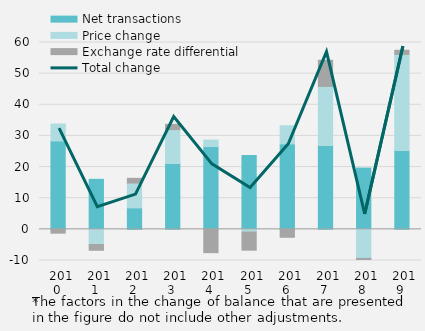
| Category | Net transactions | Price change | Exchange rate differential |
|---|---|---|---|
| 2010 | 28378.01 | 5442.489 | -1228.659 |
| 2011 | 16064.297 | -4861.316 | -1853.468 |
| 2012 | 6884.762 | 7983.318 | 1518.892 |
| 2013 | 21137.009 | 10900.181 | 1685.825 |
| 2014 | 26594.748 | 2072.293 | -7481.04 |
| 2015 | 23679.662 | -862.354 | -5824.621 |
| 2016 | 27428.199 | 5826.825 | -2542.125 |
| 2017 | 26904.693 | 18989.13 | 8388.808 |
| 2018 | 19679.093 | -9326.913 | -3260.6 |
| 2019 | 25352 | 30833 | 1318 |